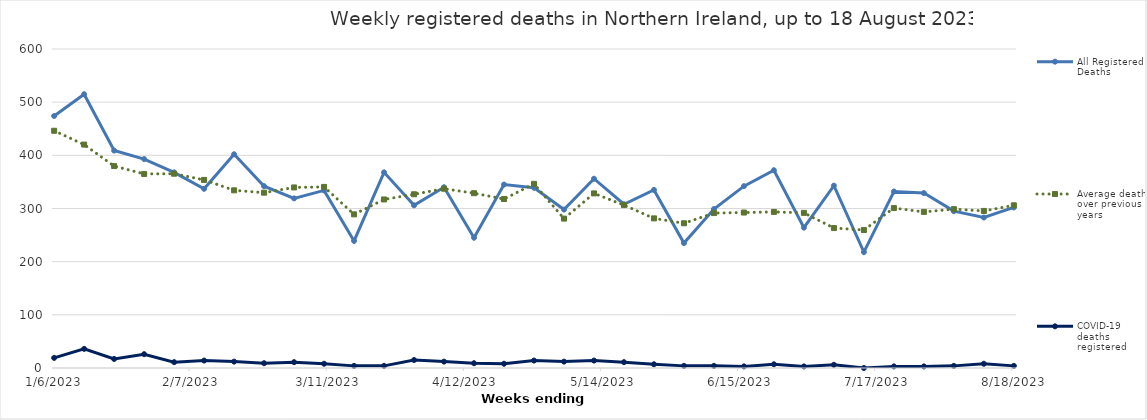
| Category | All Registered Deaths | Average deaths over previous 5 years | COVID-19 deaths registered |
|---|---|---|---|
| 1/10/20 | 395 | 402 | 0 |
| 1/17/20 | 411 | 391 | 0 |
| 1/24/20 | 347 | 382.6 | 0 |
| 1/31/20 | 323 | 373.6 | 0 |
| 2/7/20 | 332 | 345.8 | 0 |
| 2/14/20 | 306 | 339.8 | 0 |
| 2/21/20 | 297 | 317 | 0 |
| 2/28/20 | 347 | 343 | 0 |
| 3/6/20 | 312 | 356 | 0 |
| 3/13/20 | 324 | 342.8 | 0 |
| 3/20/20 | 271 | 297.2 | 1 |
| 3/27/20 | 287 | 319.6 | 9 |
| 4/3/20 | 434 | 298 | 55 |
| 4/10/20 | 435 | 294.6 | 76 |
| 4/17/20 | 424 | 290.4 | 101 |
| 4/24/20 | 470 | 283.8 | 128 |
| 5/1/20 | 427 | 319.6 | 124 |
| 5/8/20 | 336 | 273.8 | 84 |
| 5/15/20 | 396 | 294.8 | 74 |
| 5/22/20 | 325 | 289.8 | 53 |
| 5/29/20 | 316 | 279 | 49 |
| 6/5/20 | 304 | 270.6 | 20 |
| 6/12/20 | 292 | 293.2 | 21 |
| 6/19/20 | 290 | 286.4 | 17 |
| 6/26/20 | 295 | 270 | 12 |
| 7/3/20 | 289 | 288.2 | 11 |
| 7/10/20 | 275 | 255.2 | 9 |
| 7/17/20 | 240 | 264 | 2 |
| 7/24/20 | 307 | 264.6 | 7 |
| 7/31/20 | 273 | 282 | 1 |
| 8/7/20 | 280 | 276 | 5 |
| 8/14/20 | 278 | 265 | 4 |
| 8/21/20 | 313 | 263 | 6 |
| 8/28/20 | 303 | 259 | 4 |
| 9/4/20 | 234 | 255 | 3 |
| 9/11/20 | 296 | 276 | 7 |
| 9/18/20 | 322 | 282 | 8 |
| 9/25/20 | 323 | 288 | 9 |
| 10/2/20 | 328 | 286 | 2 |
| 10/9/20 | 348 | 300.4 | 11 |
| 10/16/20 | 278 | 294.8 | 17 |
| 10/23/20 | 391 | 285.6 | 42 |
| 10/30/20 | 368 | 283.6 | 51 |
| 11/6/20 | 386 | 296 | 82 |
| 11/13/20 | 406 | 297 | 96 |
| 11/20/20 | 396 | 319 | 100 |
| 11/27/20 | 348 | 311.4 | 81 |
| 12/4/20 | 387 | 322.4 | 98 |
| 12/11/20 | 366 | 321.8 | 87 |
| 12/18/20 | 350 | 343.8 | 82 |
| 12/25/20 | 310 | 280.8 | 88 |
| 1/1/21 | 333 | 279.6 | 94 |
| 1/8/21 | 568 | 417 | 145 |
| 1/15/21 | 443 | 399 | 153 |
| 1/22/21 | 474 | 375 | 182 |
| 1/29/21 | 437 | 359 | 137 |
| 2/5/21 | 462 | 337 | 126 |
| 2/12/21 | 382 | 331.6 | 99 |
| 2/19/21 | 352 | 310.8 | 78 |
| 2/26/21 | 351 | 349 | 55 |
| 3/5/21 | 319 | 338 | 33 |
| 3/12/21 | 339 | 338 | 32 |
| 3/19/21 | 253 | 286.8 | 15 |
| 3/26/21 | 307 | 315 | 19 |
| 4/2/21 | 288 | 320.2 | 12 |
| 4/9/21 | 245 | 337.4 | 9 |
| 4/16/21 | 289 | 316.4 | 16 |
| 4/23/21 | 305 | 312.4 | 7 |
| 4/30/21 | 291 | 341.8 | 8 |
| 5/7/21 | 270 | 274 | 3 |
| 5/14/21 | 329 | 323 | 7 |
| 5/21/21 | 319 | 295 | 4 |
| 5/28/21 | 265 | 284 | 3 |
| 6/4/21 | 282 | 280 | 2 |
| 6/11/21 | 265 | 284 | 2 |
| 6/18/21 | 313 | 290 | 1 |
| 6/25/21 | 319 | 271 | 2 |
| 7/2/21 | 272 | 285 | 1 |
| 7/9/21 | 298 | 250 | 3 |
| 7/16/21 | 231 | 262 | 3 |
| 7/23/21 | 306 | 285 | 9 |
| 7/30/21 | 293 | 282 | 18 |
| 8/6/21 | 342 | 273 | 31 |
| 8/13/21 | 331 | 271 | 40 |
| 8/20/21 | 343 | 279 | 43 |
| 8/27/21 | 299 | 270 | 53 |
| 9/3/21 | 340 | 250 | 64 |
| 9/10/21 | 377 | 288 | 61 |
| 9/17/21 | 374 | 282 | 63 |
| 9/24/21 | 351 | 296 | 55 |
| 10/1/21 | 380 | 294 | 48 |
| 10/8/21 | 330 | 313.6 | 28 |
| 10/15/21 | 337 | 289.6 | 38 |
| 10/22/21 | 313 | 304 | 52 |
| 10/29/21 | 320 | 302 | 50 |
| 11/5/21 | 371 | 315 | 59 |
| 11/12/21 | 403 | 320.4 | 62 |
| 11/19/21 | 375 | 339 | 42 |
| 11/26/21 | 413 | 322.2 | 65 |
| 12/3/21 | 378 | 344 | 29 |
| 12/10/21 | 368 | 336.2 | 39 |
| 12/17/21 | 363 | 345.2 | 32 |
| 12/24/21 | 347 | 282.6 | 30 |
| 12/31/21 | 243 | 299.8 | 14 |
| 1/7/22 | 416 | 446.2 | 29 |
| 1/14/22 | 445 | 418 | 43 |
| 1/21/22 | 317 | 395.8 | 43 |
| 1/28/22 | 336 | 375.2 | 38 |
| 2/4/22 | 363 | 367 | 30 |
| 2/11/22 | 375 | 346 | 40 |
| 2/18/22 | 319 | 338 | 31 |
| 2/25/22 | 327 | 334.6 | 33 |
| 3/4/22 | 338 | 342.4 | 34 |
| 3/11/22 | 338 | 344.4 | 32 |
| 3/18/22 | 301 | 279 | 25 |
| 3/25/22 | 365 | 315.2 | 33 |
| 4/1/22 | 339 | 321.8 | 38 |
| 4/8/22 | 355 | 327.4 | 32 |
| 4/15/22 | 335 | 315.8 | 20 |
| 4/22/22 | 260 | 314.8 | 22 |
| 4/29/22 | 365 | 338.8 | 28 |
| 5/6/22 | 281 | 276.4 | 16 |
| 5/13/22 | 322 | 324.4 | 16 |
| 5/20/22 | 312 | 307 | 15 |
| 5/27/22 | 329 | 281.2 | 13 |
| 6/3/22 | 220 | 279.4 | 5 |
| 6/10/22 | 342 | 281.6 | 12 |
| 6/17/22 | 298 | 292.8 | 4 |
| 6/24/22 | 322 | 284 | 10 |
| 7/1/22 | 347 | 281.6 | 19 |
| 7/8/22 | 315 | 252.6 | 24 |
| 7/15/22 | 249 | 260.4 | 27 |
| 7/22/22 | 340 | 290.4 | 27 |
| 7/29/22 | 351 | 280.8 | 22 |
| 8/5/22 | 336 | 289 | 19 |
| 8/12/22 | 301 | 282.8 | 16 |
| 8/19/22 | 320 | 295.2 | 13 |
| 8/26/22 | 315 | 269.4 | 11 |
| 9/2/22 | 263 | 265 | 6 |
| 9/9/22 | 314 | 308 | 9 |
| 9/16/22 | 333 | 298 | 6 |
| 9/23/22 | 276 | 312 | 6 |
| 9/30/22 | 299 | 315 | 11 |
| 10/7/22 | 311 | 318 | 13 |
| 10/14/22 | 308 | 299 | 8 |
| 10/21/22 | 331 | 307 | 8 |
| 10/28/22 | 339 | 312 | 19 |
| 11/4/22 | 373 | 333.2 | 12 |
| 11/11/22 | 368 | 343 | 18 |
| 11/18/22 | 386 | 345.8 | 8 |
| 11/25/22 | 360 | 339 | 12 |
| 12/2/22 | 338 | 359 | 14 |
| 12/9/22 | 360 | 345.4 | 14 |
| 12/16/22 | 360 | 353 | 7 |
| 12/23/22 | 411 | 280 | 21 |
| 12/30/22 | 238 | 308.6 | 9 |
| 1/6/23 | 474 | 446.2 | 19 |
| 1/13/23 | 515 | 420.2 | 36 |
| 1/20/23 | 409 | 379.8 | 17 |
| 1/27/23 | 393 | 365 | 26 |
| 2/3/23 | 368 | 365.4 | 11 |
| 2/10/23 | 337 | 353.8 | 14 |
| 2/17/23 | 402 | 334.2 | 12 |
| 2/24/23 | 342 | 329.8 | 9 |
| 3/3/23 | 319 | 339.6 | 11 |
| 3/10/23 | 334 | 340.6 | 8 |
| 3/17/23 | 239 | 289 | 4 |
| 3/24/23 | 368 | 317 | 4 |
| 3/31/23 | 306 | 326.8 | 15 |
| 4/7/23 | 340 | 337.2 | 12 |
| 4/14/23 | 245 | 328.8 | 9 |
| 4/21/23 | 345 | 317.8 | 8 |
| 4/28/23 | 339 | 346.4 | 14 |
| 5/5/23 | 298 | 281 | 12 |
| 5/12/23 | 356 | 328.4 | 14 |
| 5/19/23 | 308 | 306.4 | 11 |
| 5/26/23 | 335 | 281.4 | 7 |
| 6/2/23 | 235 | 272.2 | 4 |
| 6/9/23 | 299 | 291.4 | 4 |
| 6/16/23 | 342 | 292.4 | 3 |
| 6/23/23 | 372 | 293.6 | 7 |
| 6/30/23 | 264 | 291.8 | 3 |
| 7/7/23 | 343 | 263.2 | 6 |
| 7/14/23 | 218 | 259.6 | 0 |
| 7/21/23 | 332 | 300.8 | 3 |
| 7/28/23 | 329 | 293.6 | 3 |
| 8/4/23 | 295 | 298.8 | 4 |
| 8/11/23 | 283 | 295.4 | 8 |
| 8/18/23 | 302 | 306 | 4 |